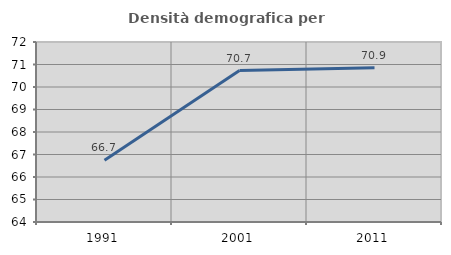
| Category | Densità demografica |
|---|---|
| 1991.0 | 66.75 |
| 2001.0 | 70.73 |
| 2011.0 | 70.86 |